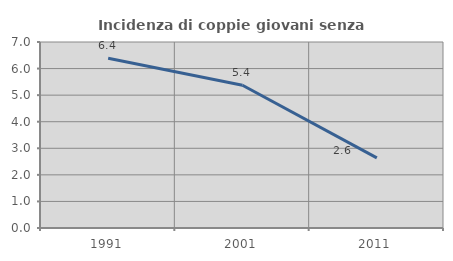
| Category | Incidenza di coppie giovani senza figli |
|---|---|
| 1991.0 | 6.386 |
| 2001.0 | 5.373 |
| 2011.0 | 2.641 |